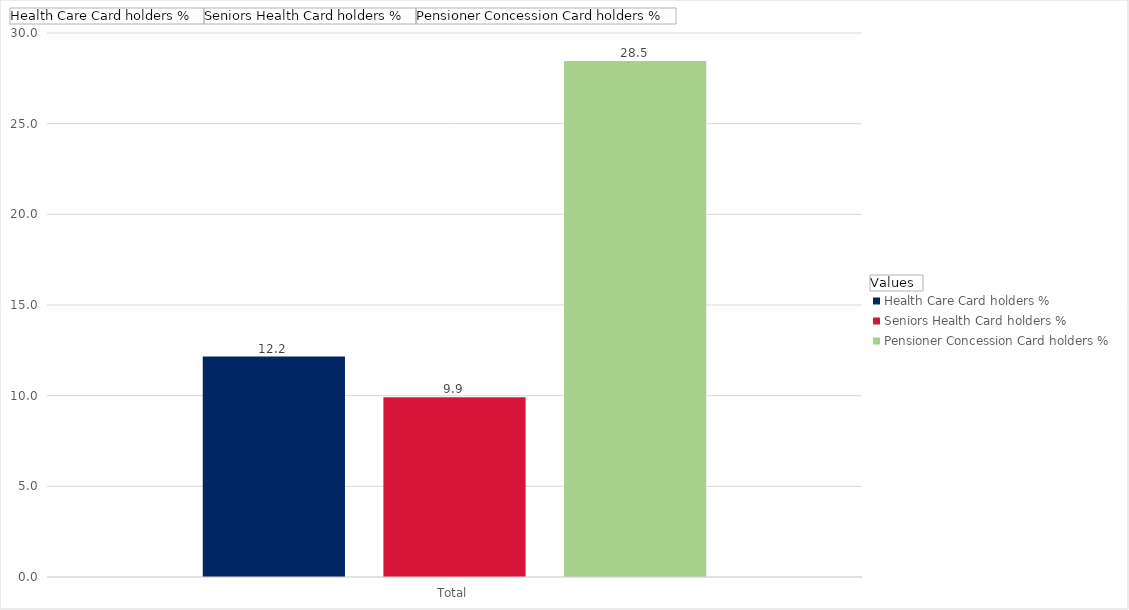
| Category | Health Care Card holders % | Seniors Health Card holders % | Pensioner Concession Card holders % |
|---|---|---|---|
| Total | 12.153 | 9.908 | 28.458 |